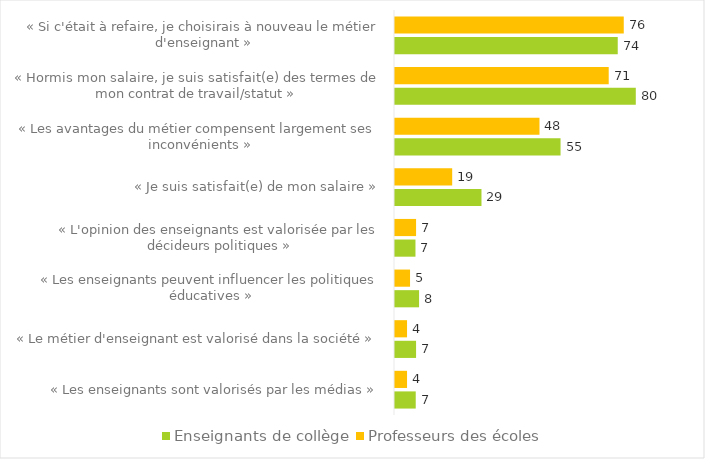
| Category | Enseignants de collège | Professeurs des écoles |
|---|---|---|
| « Les enseignants sont valorisés par les médias » | 0.069 | 0.04 |
| « Le métier d'enseignant est valorisé dans la société » | 0.07 | 0.04 |
| « Les enseignants peuvent influencer les politiques éducatives » | 0.08 | 0.05 |
| « L'opinion des enseignants est valorisée par les décideurs politiques » | 0.068 | 0.07 |
| « Je suis satisfait(e) de mon salaire » | 0.287 | 0.19 |
| « Les avantages du métier compensent largement ses inconvénients » | 0.55 | 0.48 |
| « Hormis mon salaire, je suis satisfait(e) des termes de mon contrat de travail/statut » | 0.8 | 0.71 |
| « Si c'était à refaire, je choisirais à nouveau le métier d'enseignant » | 0.74 | 0.76 |